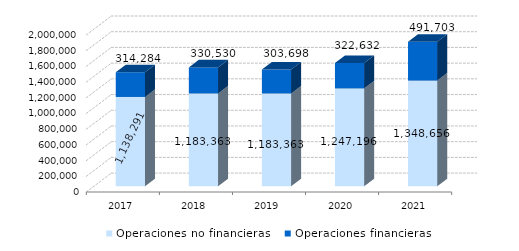
| Category | Operaciones no financieras | Operaciones financieras |
|---|---|---|
| 2017.0 | 1138290.67 | 314284.33 |
| 2018.0 | 1183363 | 330530 |
| 2019.0 | 1183362.8 | 303698.48 |
| 2020.0 | 1247196 | 322632.12 |
| 2021.0 | 1348655.89 | 491703.19 |